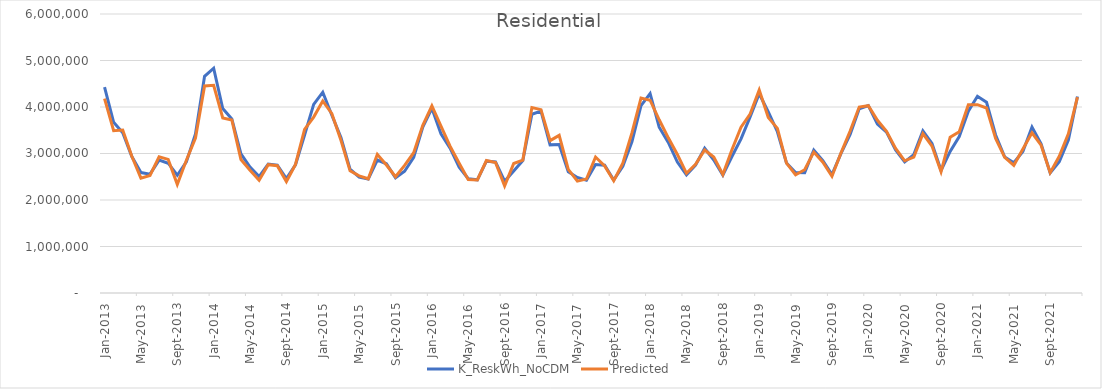
| Category |  K_ReskWh_NoCDM  | Predicted |
|---|---|---|
| 2013-01-01 | 4428921.826 | 4180622.119 |
| 2013-02-01 | 3670674.266 | 3491436.6 |
| 2013-03-01 | 3446339.246 | 3503783.48 |
| 2013-04-01 | 2934864.136 | 2940677.328 |
| 2013-05-01 | 2590039.736 | 2471390.9 |
| 2013-06-01 | 2556824.976 | 2528082.523 |
| 2013-07-01 | 2858455.076 | 2927431.002 |
| 2013-08-01 | 2791223.686 | 2873834.622 |
| 2013-09-01 | 2531996.546 | 2336520.343 |
| 2013-10-01 | 2818286.386 | 2855952.608 |
| 2013-11-01 | 3421289.156 | 3332485.15 |
| 2013-12-01 | 4658820.216 | 4452320.523 |
| 2014-01-01 | 4833879.618 | 4465450.929 |
| 2014-02-01 | 3967393.998 | 3764549.048 |
| 2014-03-01 | 3744044.188 | 3722354.24 |
| 2014-04-01 | 2993700.028 | 2872197.209 |
| 2014-05-01 | 2707831.498 | 2640893.861 |
| 2014-06-01 | 2502905.518 | 2426432.361 |
| 2014-07-01 | 2772628.518 | 2760291.239 |
| 2014-08-01 | 2751198.518 | 2737029.601 |
| 2014-09-01 | 2459305.198 | 2396889.293 |
| 2014-10-01 | 2756786.878 | 2765568.347 |
| 2014-11-01 | 3399073.178 | 3516512.843 |
| 2014-12-01 | 4055275.238 | 3782871.815 |
| 2015-01-01 | 4318021.554 | 4129312.532 |
| 2015-02-01 | 3823698.954 | 3856259.885 |
| 2015-03-01 | 3344596.974 | 3284202.687 |
| 2015-04-01 | 2663252.354 | 2626759.617 |
| 2015-05-01 | 2489621.104 | 2519448.049 |
| 2015-06-01 | 2448595.174 | 2456709.594 |
| 2015-07-01 | 2859198.364 | 2981922.393 |
| 2015-08-01 | 2778483.544 | 2752757.574 |
| 2015-09-01 | 2478158.024 | 2499792.511 |
| 2015-10-01 | 2617735.834 | 2744675.198 |
| 2015-11-01 | 2918834.204 | 3016951.39 |
| 2015-12-01 | 3569812.124 | 3605712.335 |
| 2016-01-01 | 3971822.876 | 4024471.288 |
| 2016-02-01 | 3423141.676 | 3587302.299 |
| 2016-03-01 | 3114616.606 | 3156332.732 |
| 2016-04-01 | 2706752.026 | 2788768.629 |
| 2016-05-01 | 2457069.856 | 2438474.943 |
| 2016-06-01 | 2433898.016 | 2430327.99 |
| 2016-07-01 | 2834544.046 | 2847801.925 |
| 2016-08-01 | 2816805.176 | 2806240.858 |
| 2016-09-01 | 2404656.076 | 2304339.992 |
| 2016-10-01 | 2624969.006 | 2785192.911 |
| 2016-11-01 | 2850520.466 | 2857366.453 |
| 2016-12-01 | 3844258.566 | 3988110.164 |
| 2017-01-01 | 3911552.05 | 3942803.125 |
| 2017-02-01 | 3185836.25 | 3276386.674 |
| 2017-03-01 | 3193843.69 | 3389275.026 |
| 2017-04-01 | 2605657.17 | 2657638.024 |
| 2017-05-01 | 2485385.25 | 2405245.783 |
| 2017-06-01 | 2427147.37 | 2452205.248 |
| 2017-07-01 | 2761935.46 | 2924111.012 |
| 2017-08-01 | 2746239.76 | 2730273.933 |
| 2017-09-01 | 2428924.49 | 2414439.931 |
| 2017-10-01 | 2724484.92 | 2791858.788 |
| 2017-11-01 | 3253673.75 | 3443156.564 |
| 2017-12-01 | 4030424.28 | 4194474.9 |
| 2018-01-01 | 4288565.563 | 4146541.78 |
| 2018-02-01 | 3566235.523 | 3724956.902 |
| 2018-03-01 | 3237215.653 | 3336667.752 |
| 2018-04-01 | 2815933.173 | 2979550.334 |
| 2018-05-01 | 2538073.133 | 2574297.215 |
| 2018-06-01 | 2751481.083 | 2767314.893 |
| 2018-07-01 | 3112005.473 | 3075113.393 |
| 2018-08-01 | 2860918.063 | 2924828.449 |
| 2018-09-01 | 2537095.363 | 2547271.989 |
| 2018-10-01 | 2935509.513 | 3079430.037 |
| 2018-11-01 | 3314619.233 | 3564880.682 |
| 2018-12-01 | 3786599.573 | 3849160.572 |
| 2019-01-01 | 4285205.796 | 4363410.842 |
| 2019-02-01 | 3895326.666 | 3772140.715 |
| 2019-03-01 | 3468572.046 | 3540608.413 |
| 2019-04-01 | 2797522.226 | 2792608.905 |
| 2019-05-01 | 2592204.766 | 2542865.557 |
| 2019-06-01 | 2584379.146 | 2650967.984 |
| 2019-07-01 | 3074702.616 | 3030778.756 |
| 2019-08-01 | 2844241.276 | 2814371.121 |
| 2019-09-01 | 2545163.476 | 2511490.186 |
| 2019-10-01 | 3003280.746 | 3015106.4 |
| 2019-11-01 | 3409057.636 | 3482578.49 |
| 2019-12-01 | 3963285.676 | 3998963.559 |
| 2020-01-01 | 4030396.568 | 4028802.845 |
| 2020-02-01 | 3631748.828 | 3714396.015 |
| 2020-03-01 | 3459845.648 | 3477768.812 |
| 2020-04-01 | 3078909.078 | 3109005.025 |
| 2020-05-01 | 2818922.108 | 2843179.299 |
| 2020-06-01 | 2976371.978 | 2920998.31 |
| 2020-07-01 | 3484374.458 | 3425665.295 |
| 2020-08-01 | 3214421.348 | 3160857.376 |
| 2020-09-01 | 2636023.228 | 2609967.05 |
| 2020-10-01 | 3046148.428 | 3348067.032 |
| 2020-11-01 | 3365137.538 | 3468492.387 |
| 2020-12-01 | 3910104.818 | 4048711.431 |
| 2021-01-01 | 4229260.465 | 4050941.868 |
| 2021-02-01 | 4102103.485 | 3978827.8 |
| 2021-03-01 | 3397547.245 | 3324294.413 |
| 2021-04-01 | 2925565.305 | 2917685.465 |
| 2021-05-01 | 2801679.185 | 2746452.807 |
| 2021-06-01 | 3044908.995 | 3097300.988 |
| 2021-07-01 | 3569609.315 | 3445302.578 |
| 2021-08-01 | 3210417.875 | 3178503.111 |
| 2021-09-01 | 2585062.285 | 2588895.676 |
| 2021-10-01 | 2821908.565 | 2940607.52 |
| 2021-11-01 | 3289645.845 | 3423425.351 |
| 2021-12-01 | 4224541.485 | 4211306.819 |